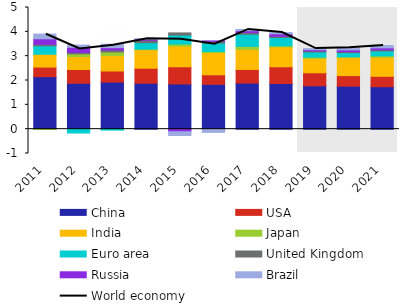
| Category | China | USA | India | Japan | Euro area | United Kingdom | Russia | Brazil |
|---|---|---|---|---|---|---|---|---|
| 2011.0 | 2.157 | 0.395 | 0.526 | -0.009 | 0.349 | 0.059 | 0.228 | 0.194 |
| 2012.0 | 1.885 | 0.566 | 0.535 | 0.11 | -0.158 | 0.056 | 0.211 | 0.092 |
| 2013.0 | 1.936 | 0.454 | 0.635 | 0.146 | -0.039 | 0.081 | 0.096 | 0.143 |
| 2014.0 | 1.887 | 0.618 | 0.76 | 0.026 | 0.264 | 0.097 | 0.04 | 0.023 |
| 2015.0 | 1.858 | 0.706 | 0.85 | 0.084 | 0.371 | 0.087 | -0.107 | -0.153 |
| 2016.0 | 1.843 | 0.391 | 0.913 | 0.041 | 0.352 | 0.07 | 0.015 | -0.132 |
| 2017.0 | 1.895 | 0.558 | 0.826 | 0.124 | 0.5 | 0.068 | 0.076 | 0.052 |
| 2018.0 | 1.876 | 0.687 | 0.815 | 0.049 | 0.342 | 0.048 | 0.103 | 0.051 |
| 2019.0 | 1.782 | 0.535 | 0.595 | 0.048 | 0.212 | 0.044 | 0.05 | 0.046 |
| 2020.0 | 1.767 | 0.435 | 0.748 | 0.023 | 0.173 | 0.037 | 0.075 | 0.083 |
| 2021.0 | 1.745 | 0.428 | 0.794 | 0.046 | 0.204 | 0.046 | 0.079 | 0.097 |